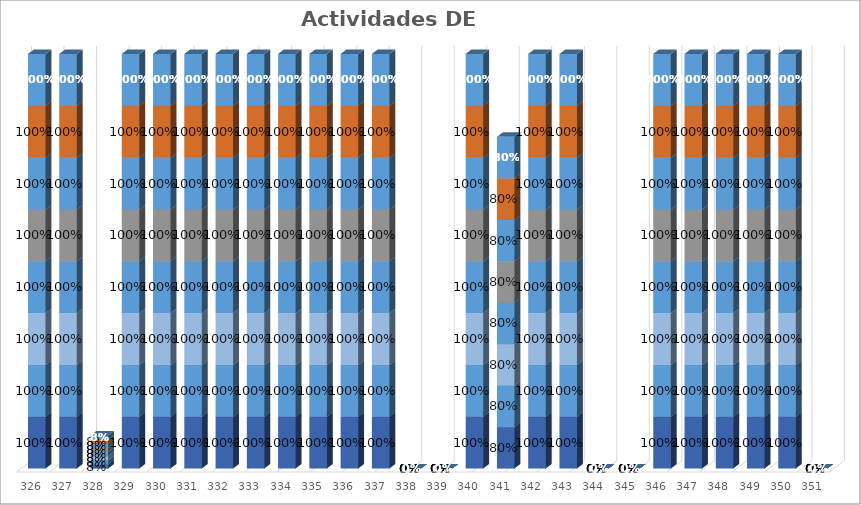
| Category | % Avance |
|---|---|
| 326.0 | 1 |
| 327.0 | 1 |
| 328.0 | 0.08 |
| 329.0 | 1 |
| 330.0 | 1 |
| 331.0 | 1 |
| 332.0 | 1 |
| 333.0 | 1 |
| 334.0 | 1 |
| 335.0 | 1 |
| 336.0 | 1 |
| 337.0 | 1 |
| 338.0 | 0 |
| 339.0 | 0 |
| 340.0 | 1 |
| 341.0 | 0.8 |
| 342.0 | 1 |
| 343.0 | 1 |
| 344.0 | 0 |
| 345.0 | 0 |
| 346.0 | 1 |
| 347.0 | 1 |
| 348.0 | 1 |
| 349.0 | 1 |
| 350.0 | 1 |
| 351.0 | 0 |